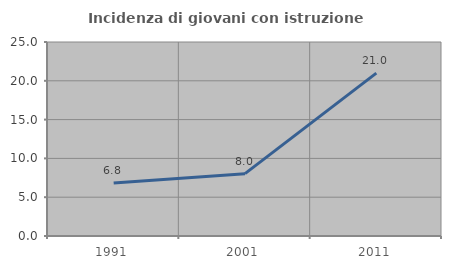
| Category | Incidenza di giovani con istruzione universitaria |
|---|---|
| 1991.0 | 6.836 |
| 2001.0 | 8.035 |
| 2011.0 | 20.995 |